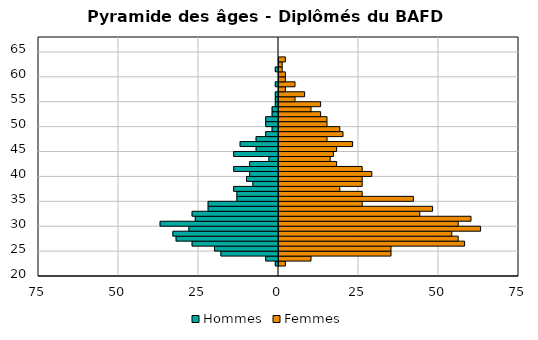
| Category | Hommes | Femmes |
|---|---|---|
| 20.0 | 0 | 0 |
| 21.0 | 0 | 0 |
| 22.0 | -1 | 2 |
| 23.0 | -4 | 10 |
| 24.0 | -18 | 35 |
| 25.0 | -20 | 35 |
| 26.0 | -27 | 58 |
| 27.0 | -32 | 56 |
| 28.0 | -33 | 54 |
| 29.0 | -28 | 63 |
| 30.0 | -37 | 56 |
| 31.0 | -26 | 60 |
| 32.0 | -27 | 44 |
| 33.0 | -22 | 48 |
| 34.0 | -22 | 26 |
| 35.0 | -13 | 42 |
| 36.0 | -13 | 26 |
| 37.0 | -14 | 19 |
| 38.0 | -8 | 26 |
| 39.0 | -10 | 26 |
| 40.0 | -9 | 29 |
| 41.0 | -14 | 26 |
| 42.0 | -9 | 18 |
| 43.0 | -3 | 16 |
| 44.0 | -14 | 17 |
| 45.0 | -7 | 18 |
| 46.0 | -12 | 23 |
| 47.0 | -7 | 15 |
| 48.0 | -4 | 20 |
| 49.0 | -2 | 19 |
| 50.0 | -4 | 15 |
| 51.0 | -4 | 15 |
| 52.0 | -2 | 13 |
| 53.0 | -2 | 10 |
| 54.0 | -1 | 13 |
| 55.0 | -1 | 5 |
| 56.0 | -1 | 8 |
| 57.0 | 0 | 2 |
| 58.0 | -1 | 5 |
| 59.0 | 0 | 2 |
| 60.0 | 0 | 2 |
| 61.0 | -1 | 1 |
| 62.0 | 0 | 1 |
| 63.0 | 0 | 2 |
| 64.0 | 0 | 0 |
| 65.0 | 0 | 0 |
| 67.0 | 0 | 0 |
| 69.0 | 0 | 0 |